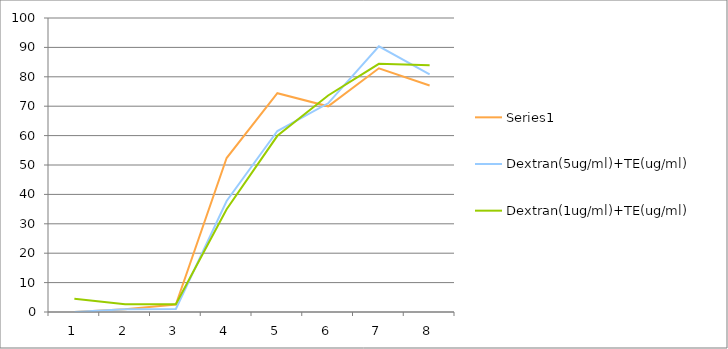
| Category | Series 0 | Dextran(5ug/ml)+TE(ug/ml) | Dextran(1ug/ml)+TE(ug/ml) |
|---|---|---|---|
| 0 | 0 | 0 | 4.484 |
| 1 | 0.959 | 0.902 | 2.651 |
| 2 | 2.538 | 1.043 | 2.623 |
| 3 | 52.369 | 37.761 | 34.969 |
| 4 | 74.422 | 61.562 | 59.927 |
| 5 | 69.966 | 70.981 | 73.632 |
| 6 | 82.91 | 90.384 | 84.405 |
| 7 | 77.045 | 80.795 | 83.926 |